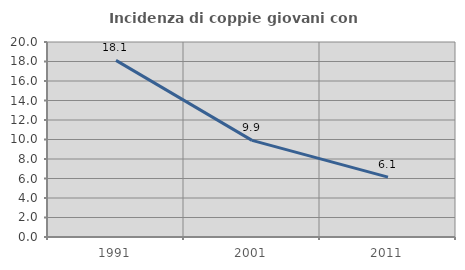
| Category | Incidenza di coppie giovani con figli |
|---|---|
| 1991.0 | 18.118 |
| 2001.0 | 9.908 |
| 2011.0 | 6.136 |